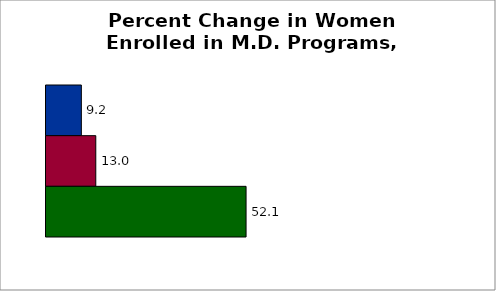
| Category | 50 states and D.C. | SREB states | State |
|---|---|---|---|
| 0 | 9.213 | 12.975 | 52.136 |